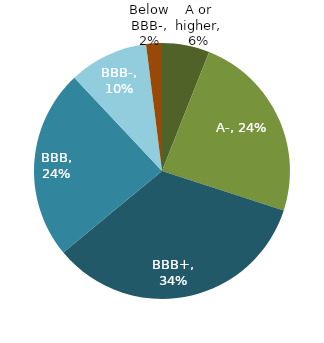
| Category | Series 0 |
|---|---|
| A or higher | 0.06 |
| A- | 0.24 |
| BBB+ | 0.34 |
| BBB | 0.24 |
| BBB- | 0.1 |
| Below BBB- | 0.02 |